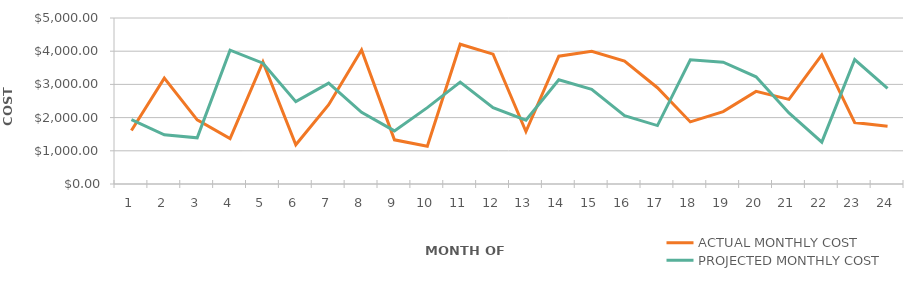
| Category | ACTUAL MONTHLY COST | PROJECTED MONTHLY COST |
|---|---|---|
| 1.0 | 1610 | 1940 |
| 2.0 | 3190 | 1480 |
| 3.0 | 1930 | 1390 |
| 4.0 | 1370 | 4030 |
| 5.0 | 3680 | 3640 |
| 6.0 | 1180 | 2480 |
| 7.0 | 2390 | 3040 |
| 8.0 | 4040 | 2160 |
| 9.0 | 1330 | 1600 |
| 10.0 | 1140 | 2300 |
| 11.0 | 4210 | 3070 |
| 12.0 | 3910 | 2300 |
| 13.0 | 1580 | 1920 |
| 14.0 | 3850 | 3140 |
| 15.0 | 4000 | 2850 |
| 16.0 | 3700 | 2060 |
| 17.0 | 2900 | 1760 |
| 18.0 | 1870 | 3740 |
| 19.0 | 2180 | 3670 |
| 20.0 | 2790 | 3230 |
| 21.0 | 2550 | 2140 |
| 22.0 | 3890 | 1260 |
| 23.0 | 1850 | 3750 |
| 24.0 | 1740 | 2880 |